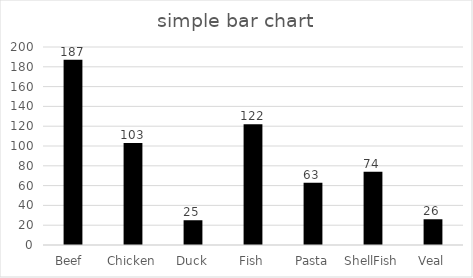
| Category | Series 0 |
|---|---|
| Beef  | 187 |
| Chicken | 103 |
| Duck | 25 |
| Fish | 122 |
| Pasta | 63 |
| ShellFish | 74 |
| Veal | 26 |